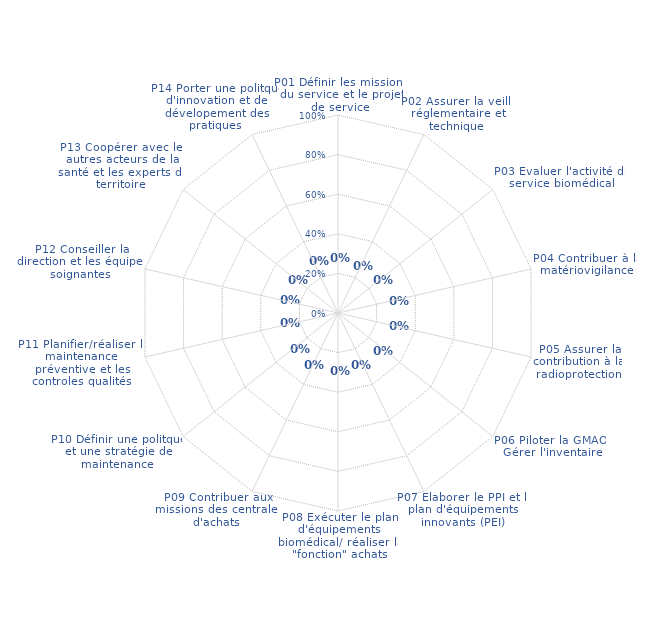
| Category | Evaluation de 14 processus |
|---|---|
| P01 Définir les missions du service et le projet de service | 0 |
| P02 Assurer la veille réglementaire et technique | 0 |
| P03 Evaluer l'activité du service biomédical | 0 |
| P04 Contribuer à la matériovigilance | 0 |
| P05 Assurer la contribution à la radioprotection | 0 |
| P06 Piloter la GMAO/ Gérer l'inventaire | 0 |
| P07 Elaborer le PPI et le plan d'équipements innovants (PEI) | 0 |
| P08 Exécuter le plan d'équipements biomédical/ réaliser la "fonction" achats | 0 |
| P09 Contribuer aux missions des centrales d'achats | 0 |
| P10 Définir une politque et une stratégie de maintenance | 0 |
| P11 Planifier/réaliser la maintenance préventive et les controles qualités | 0 |
| P12 Conseiller la direction et les équipes soignantes | 0 |
| P13 Coopérer avec les autres acteurs de la santé et les experts du territoire | 0 |
| P14 Porter une politque d'innovation et de dévelopement des pratiques | 0 |